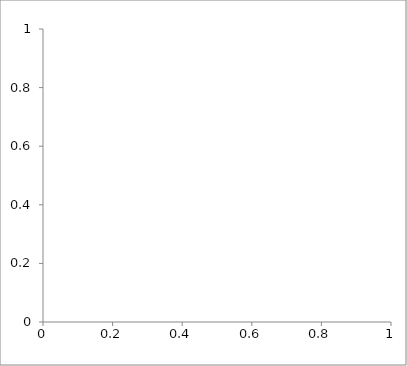
| Category | rand |
|---|---|
| 0.0 | 0 |
| 0.0 | 0 |
| 0.0 | 0 |
| 0.0 | 0 |
| 0.0 | 0 |
| 0.0 | 0 |
| 0.0 | 0 |
| 0.0 | 0 |
| 0.0 | 0 |
| 0.0 | 0 |
| 0.0 | 0 |
| 0.0 | 0 |
| 0.0 | 0 |
| 0.0 | 0 |
| 0.0 | 0 |
| 0.0 | 0 |
| 0.0 | 0 |
| 0.0 | 0 |
| 0.0 | 0 |
| 0.0 | 0 |
| 0.0 | 0 |
| 0.0 | 0 |
| 0.0 | 0 |
| 0.0 | 0 |
| 0.0 | 0 |
| 0.0 | 0 |
| 0.0 | 0 |
| 0.0 | 0 |
| 0.0 | 0 |
| 0.0 | 0 |
| 0.0 | 0 |
| 0.0 | 0 |
| 0.0 | 0 |
| 0.0 | 0 |
| 0.0 | 0 |
| 0.0 | 0 |
| 0.0 | 0 |
| 0.0 | 0 |
| 0.0 | 0 |
| 0.0 | 0 |
| 0.0 | 0 |
| 0.0 | 0 |
| 0.0 | 0 |
| 0.0 | 0 |
| 0.0 | 0 |
| 0.0 | 0 |
| 0.0 | 0 |
| 0.0 | 0 |
| 0.0 | 0 |
| 0.0 | 0 |
| 0.0 | 0 |
| 0.0 | 0 |
| 0.0 | 0 |
| 0.0 | 0 |
| 0.0 | 0 |
| 0.0 | 0 |
| 0.0 | 0 |
| 0.0 | 0 |
| 0.0 | 0 |
| 0.0 | 0 |
| 0.0 | 0 |
| 0.0 | 0 |
| 0.0 | 0 |
| 0.0 | 0 |
| 0.0 | 0 |
| 0.0 | 0 |
| 0.0 | 0 |
| 0.0 | 0 |
| 0.0 | 0 |
| 0.0 | 0 |
| 0.0 | 0 |
| 0.0 | 0 |
| 0.0 | 0 |
| 0.0 | 0 |
| 0.0 | 0 |
| 0.0 | 0 |
| 0.0 | 0 |
| 0.0 | 0 |
| 0.0 | 0 |
| 0.0 | 0 |
| 0.0 | 0 |
| 0.0 | 0 |
| 0.0 | 0 |
| 0.0 | 0 |
| 0.0 | 0 |
| 0.0 | 0 |
| 0.0 | 0 |
| 0.0 | 0 |
| 0.0 | 0 |
| 0.0 | 0 |
| 0.0 | 0 |
| 0.0 | 0 |
| 0.0 | 0 |
| 0.0 | 0 |
| 0.0 | 0 |
| 0.0 | 0 |
| 0.0 | 0 |
| 0.0 | 0 |
| 0.0 | 0 |
| 0.0 | 0 |